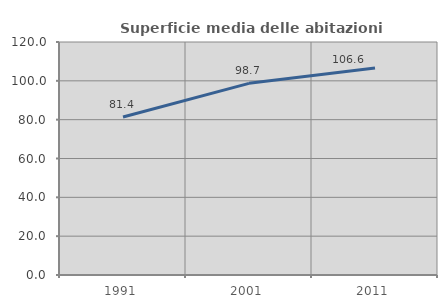
| Category | Superficie media delle abitazioni occupate |
|---|---|
| 1991.0 | 81.389 |
| 2001.0 | 98.716 |
| 2011.0 | 106.644 |